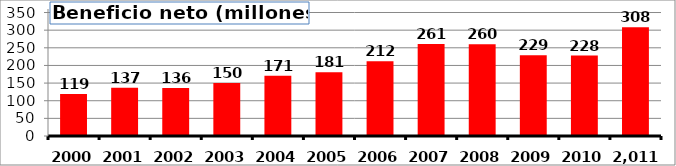
| Category | Beneficio neto |
|---|---|
| 2000.0 | 119 |
| 2001.0 | 137 |
| 2002.0 | 136 |
| 2003.0 | 150 |
| 2004.0 | 171 |
| 2005.0 | 181 |
| 2006.0 | 212 |
| 2007.0 | 261 |
| 2008.0 | 260 |
| 2009.0 | 229 |
| 2010.0 | 228 |
| 2011.0 | 308 |